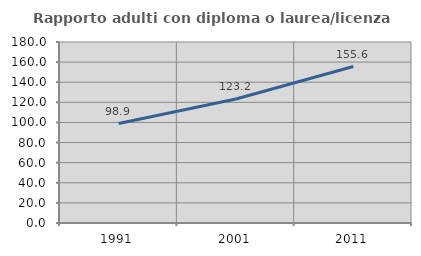
| Category | Rapporto adulti con diploma o laurea/licenza media  |
|---|---|
| 1991.0 | 98.898 |
| 2001.0 | 123.246 |
| 2011.0 | 155.623 |